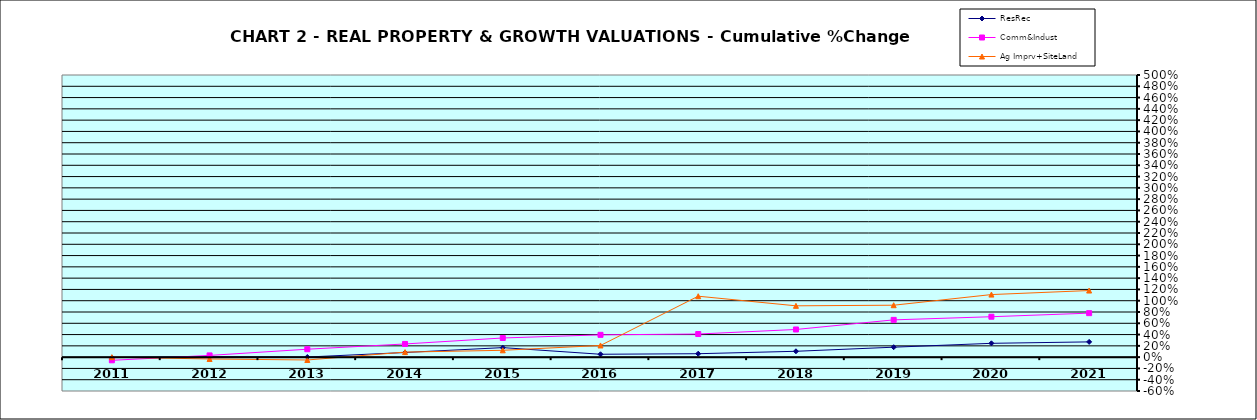
| Category | ResRec | Comm&Indust | Ag Imprv+SiteLand |
|---|---|---|---|
| 2011.0 | -0.008 | -0.056 | 0 |
| 2012.0 | 0.009 | 0.031 | -0.033 |
| 2013.0 | 0.002 | 0.141 | -0.05 |
| 2014.0 | 0.082 | 0.234 | 0.089 |
| 2015.0 | 0.169 | 0.34 | 0.121 |
| 2016.0 | 0.051 | 0.395 | 0.207 |
| 2017.0 | 0.061 | 0.41 | 1.08 |
| 2018.0 | 0.104 | 0.49 | 0.91 |
| 2019.0 | 0.176 | 0.661 | 0.92 |
| 2020.0 | 0.245 | 0.716 | 1.109 |
| 2021.0 | 0.27 | 0.78 | 1.18 |